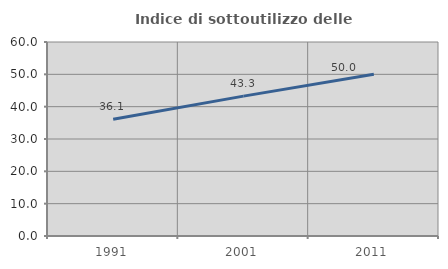
| Category | Indice di sottoutilizzo delle abitazioni  |
|---|---|
| 1991.0 | 36.116 |
| 2001.0 | 43.256 |
| 2011.0 | 50.022 |